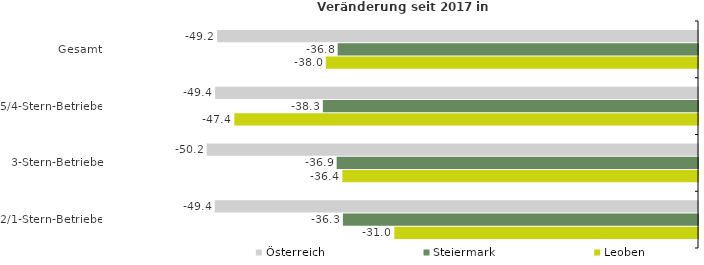
| Category | Österreich | Steiermark | Leoben |
|---|---|---|---|
| Gesamt | -49.154 | -36.835 | -38.044 |
| 5/4-Stern-Betriebe | -49.355 | -38.346 | -47.395 |
| 3-Stern-Betriebe | -50.222 | -36.936 | -36.351 |
| 2/1-Stern-Betriebe | -49.399 | -36.296 | -31.038 |